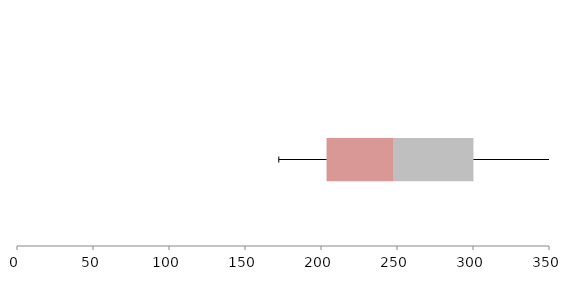
| Category | Series 1 | Series 2 | Series 3 |
|---|---|---|---|
| 0 | 203.644 | 43.722 | 52.919 |